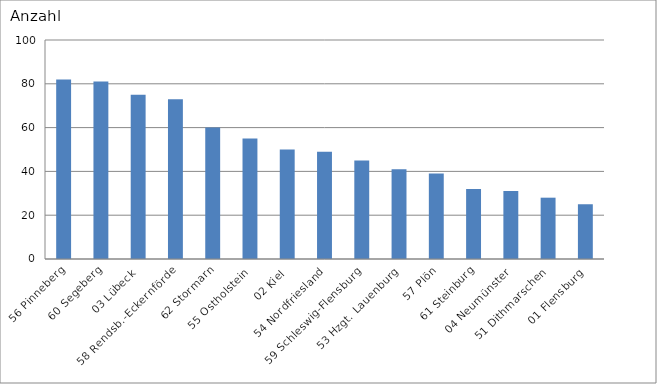
| Category | 56 Pinneberg 60 Segeberg 03 Lübeck 58 Rendsb.-Eckernförde 62 Stormarn 55 Ostholstein 02 Kiel 54 Nordfriesland 59 Schleswig-Flensburg 53 Hzgt. Lauenburg 57 Plön 61 Steinburg 04 Neumünster 51 Dithmarschen 01 Flensburg |
|---|---|
| 56 Pinneberg | 82 |
| 60 Segeberg | 81 |
| 03 Lübeck | 75 |
| 58 Rendsb.-Eckernförde | 73 |
| 62 Stormarn | 60 |
| 55 Ostholstein | 55 |
| 02 Kiel | 50 |
| 54 Nordfriesland | 49 |
| 59 Schleswig-Flensburg | 45 |
| 53 Hzgt. Lauenburg | 41 |
| 57 Plön | 39 |
| 61 Steinburg | 32 |
| 04 Neumünster | 31 |
| 51 Dithmarschen | 28 |
| 01 Flensburg | 25 |